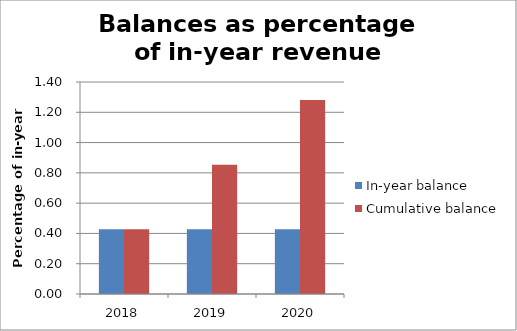
| Category | In-year balance | Cumulative balance |
|---|---|---|
| 2018.0 | 0.427 | 0.427 |
| 2019.0 | 0.427 | 0.854 |
| 2020.0 | 0.427 | 1.28 |